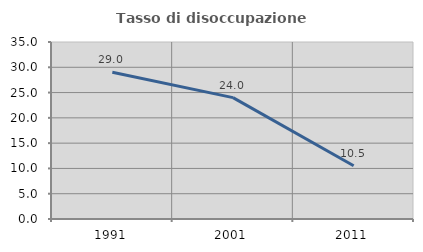
| Category | Tasso di disoccupazione giovanile  |
|---|---|
| 1991.0 | 29.032 |
| 2001.0 | 24 |
| 2011.0 | 10.526 |